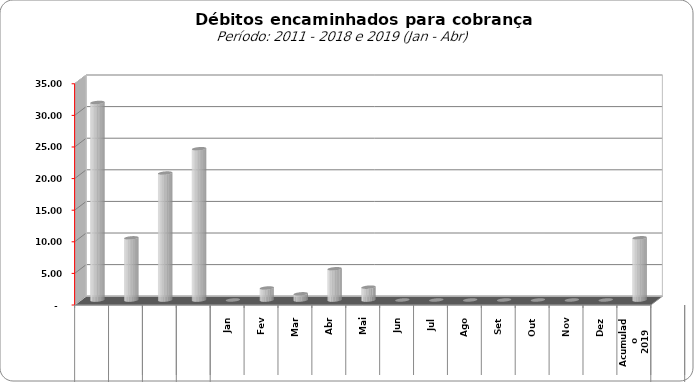
| Category |  3.309.443,02   3.859.728,44   11.181.928,25   7.600.526,01   31.248.623,50   9.830.198,34   20.083.556,95   23.931.734,08   -     1.897.202,11   974.309,37   4.937.737,42   2.030.400,14   -     -     -     -     -     -     -     9.839.649,04  |
|---|---|
| 0 | 31248623.5 |
| 1 | 9830198.34 |
| 2 | 20083556.95 |
| 3 | 23931734.08 |
| 4 | 0 |
| 5 | 1897202.11 |
| 6 | 974309.37 |
| 7 | 4937737.42 |
| 8 | 2030400.14 |
| 9 | 0 |
| 10 | 0 |
| 11 | 0 |
| 12 | 0 |
| 13 | 0 |
| 14 | 0 |
| 15 | 0 |
| 16 | 9839649.04 |